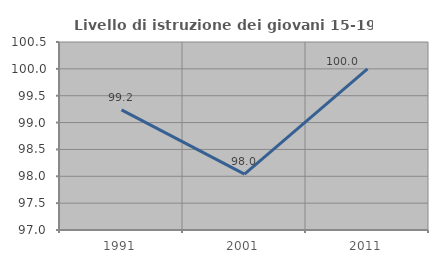
| Category | Livello di istruzione dei giovani 15-19 anni |
|---|---|
| 1991.0 | 99.237 |
| 2001.0 | 98.039 |
| 2011.0 | 100 |